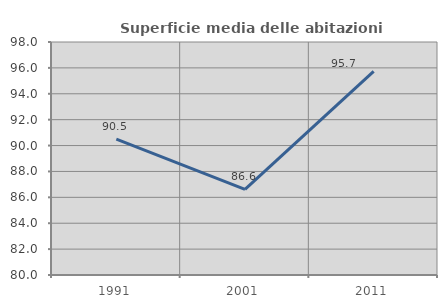
| Category | Superficie media delle abitazioni occupate |
|---|---|
| 1991.0 | 90.493 |
| 2001.0 | 86.612 |
| 2011.0 | 95.725 |